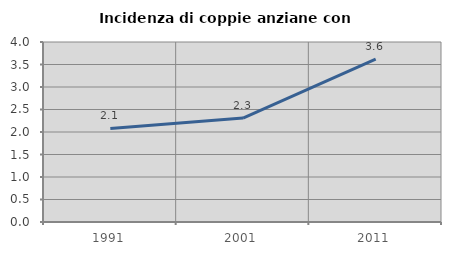
| Category | Incidenza di coppie anziane con figli |
|---|---|
| 1991.0 | 2.078 |
| 2001.0 | 2.31 |
| 2011.0 | 3.619 |